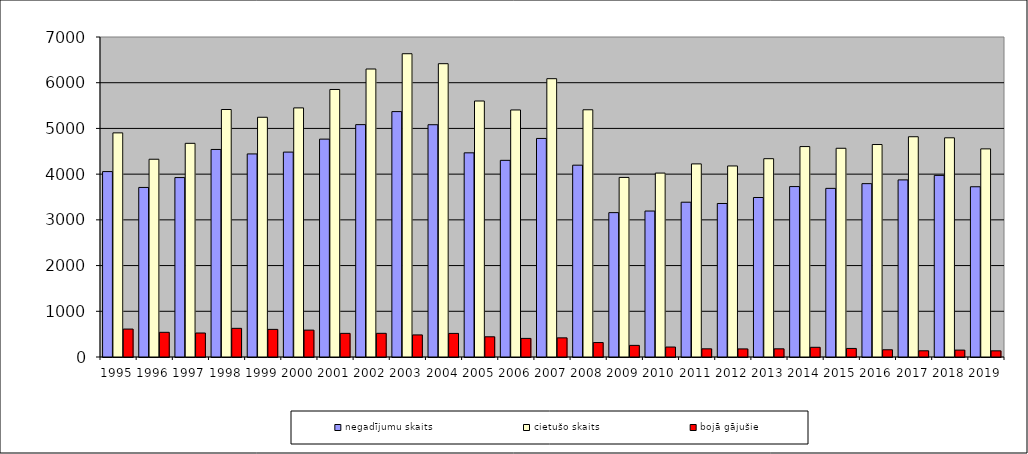
| Category | negadījumu skaits | cietušo skaits | bojā gājušie |
|---|---|---|---|
| 1995.0 | 4056 | 4903 | 611 |
| 1996.0 | 3709 | 4326 | 540 |
| 1997.0 | 3925 | 4674 | 525 |
| 1998.0 | 4540 | 5414 | 627 |
| 1999.0 | 4442 | 5244 | 604 |
| 2000.0 | 4482 | 5449 | 588 |
| 2001.0 | 4766 | 5852 | 517 |
| 2002.0 | 5083 | 6300 | 518 |
| 2003.0 | 5368 | 6634 | 483 |
| 2004.0 | 5081 | 6416 | 516 |
| 2005.0 | 4466 | 5600 | 442 |
| 2006.0 | 4302 | 5404 | 407 |
| 2007.0 | 4781 | 6088 | 419 |
| 2008.0 | 4196 | 5408 | 316 |
| 2009.0 | 3158 | 3928 | 254 |
| 2010.0 | 3193 | 4023 | 218 |
| 2011.0 | 3386 | 4224 | 179 |
| 2012.0 | 3358 | 4179 | 177 |
| 2013.0 | 3489 | 4338 | 179 |
| 2014.0 | 3728 | 4603 | 212 |
| 2015.0 | 3689 | 4566 | 187 |
| 2016.0 | 3792 | 4648 | 158 |
| 2017.0 | 3874 | 4818 | 136 |
| 2018.0 | 3973 | 4795 | 151 |
| 2019.0 | 3724 | 4553 | 135 |